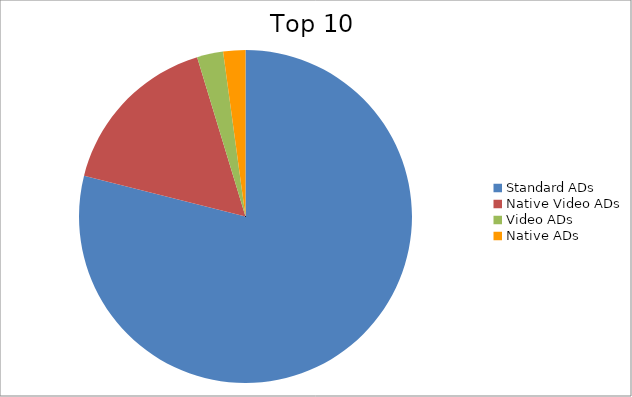
| Category | Series 0 |
|---|---|
| Standard ADs | 78.93 |
| Native Video ADs | 16.38 |
| Video ADs | 2.54 |
| Native ADs | 2.15 |